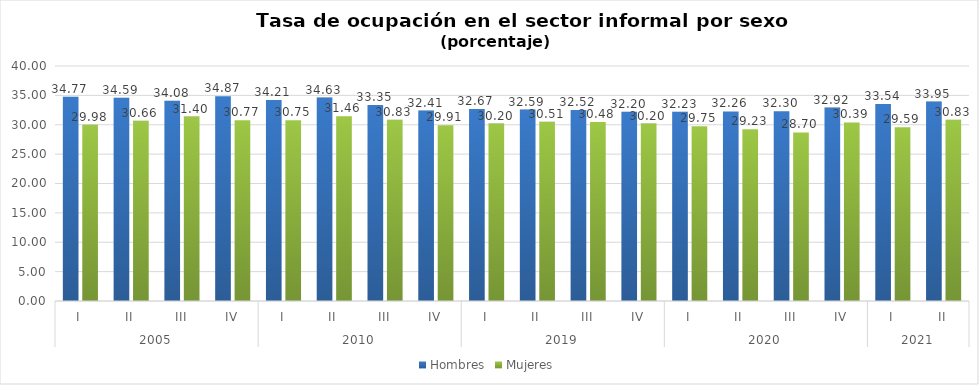
| Category | Hombres | Mujeres |
|---|---|---|
| 0 | 34.767 | 29.984 |
| 1 | 34.594 | 30.661 |
| 2 | 34.075 | 31.4 |
| 3 | 34.871 | 30.77 |
| 4 | 34.214 | 30.748 |
| 5 | 34.631 | 31.457 |
| 6 | 33.348 | 30.831 |
| 7 | 32.406 | 29.913 |
| 8 | 32.673 | 30.2 |
| 9 | 32.589 | 30.507 |
| 10 | 32.515 | 30.479 |
| 11 | 32.197 | 30.203 |
| 12 | 32.227 | 29.752 |
| 13 | 32.265 | 29.226 |
| 14 | 32.303 | 28.7 |
| 15 | 32.919 | 30.391 |
| 16 | 33.539 | 29.593 |
| 17 | 33.954 | 30.834 |